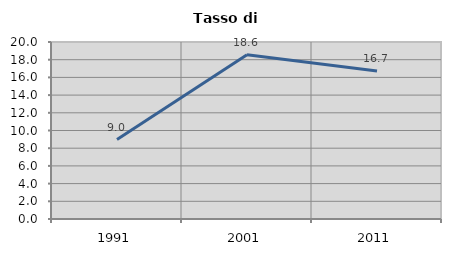
| Category | Tasso di disoccupazione   |
|---|---|
| 1991.0 | 8.974 |
| 2001.0 | 18.551 |
| 2011.0 | 16.726 |